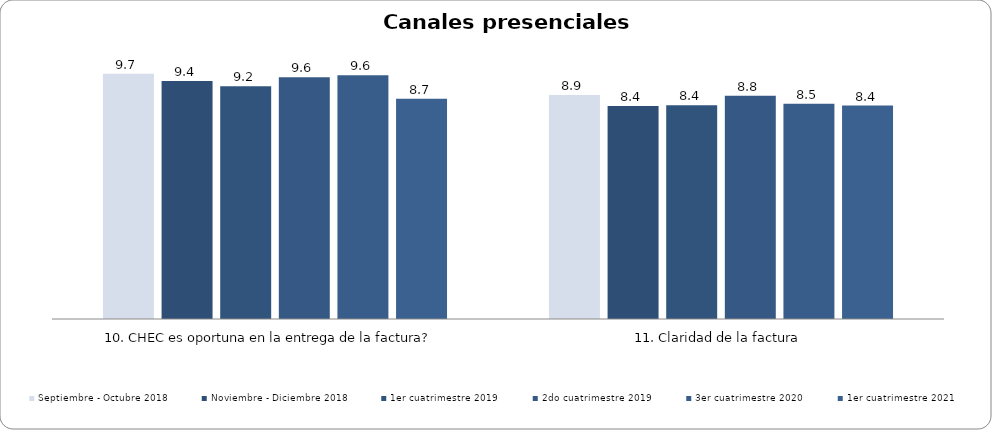
| Category | Septiembre - Octubre 2018 | Noviembre - Diciembre 2018 | 1er cuatrimestre 2019 | 2do cuatrimestre 2019 | 3er cuatrimestre 2020 | 1er cuatrimestre 2021 |
|---|---|---|---|---|---|---|
| 10. CHEC es oportuna en la entrega de la factura? | 9.697 | 9.405 | 9.196 | 9.559 | 9.632 | 8.71 |
| 11. Claridad de la factura | 8.853 | 8.416 | 8.447 | 8.821 | 8.508 | 8.435 |